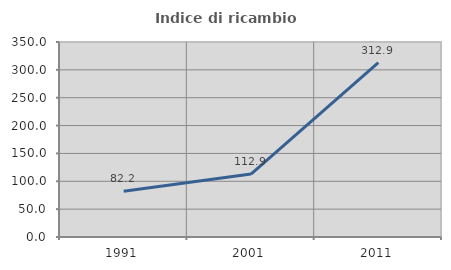
| Category | Indice di ricambio occupazionale  |
|---|---|
| 1991.0 | 82.184 |
| 2001.0 | 112.95 |
| 2011.0 | 312.903 |